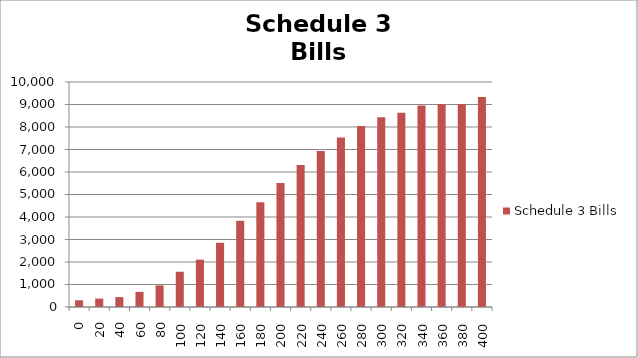
| Category | Schedule 3 Bills |
|---|---|
| 0.0 | 298.426 |
| 20.0 | 373.032 |
| 40.0 | 439.545 |
| 60.0 | 671.384 |
| 80.0 | 959.475 |
| 100.0 | 1567.215 |
| 120.0 | 2101.979 |
| 140.0 | 2854.77 |
| 160.0 | 3835.577 |
| 180.0 | 4659.515 |
| 200.0 | 5510.762 |
| 220.0 | 6310.869 |
| 240.0 | 6937.149 |
| 260.0 | 7532.83 |
| 280.0 | 8045.954 |
| 300.0 | 8429.247 |
| 320.0 | 8629.508 |
| 340.0 | 8959.685 |
| 360.0 | 9017.902 |
| 380.0 | 9008.951 |
| 400.0 | 9336.636 |